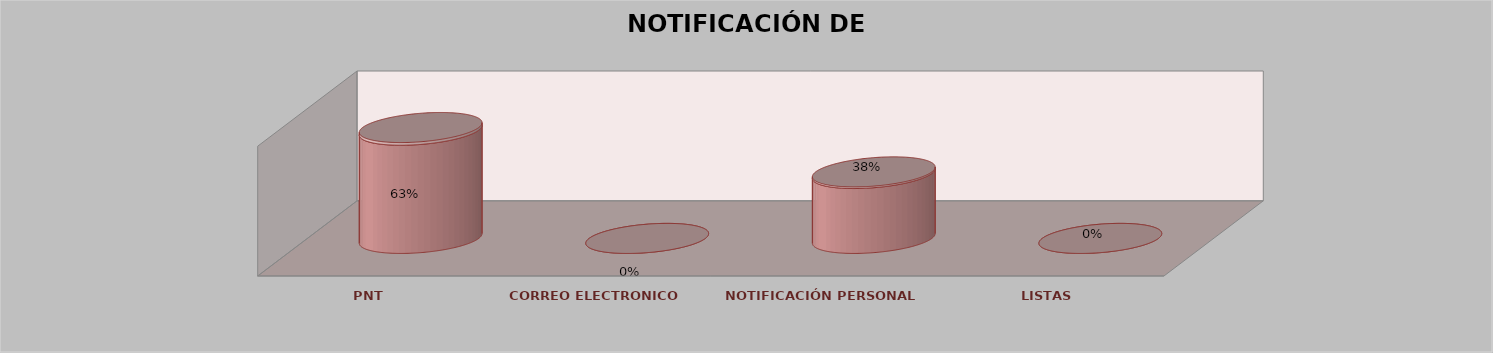
| Category | Series 0 | Series 1 | Series 2 | Series 3 | Series 4 |
|---|---|---|---|---|---|
| PNT |  |  |  | 25 | 0.625 |
| CORREO ELECTRONICO |  |  |  | 0 | 0 |
| NOTIFICACIÓN PERSONAL |  |  |  | 15 | 0.375 |
| LISTAS |  |  |  | 0 | 0 |